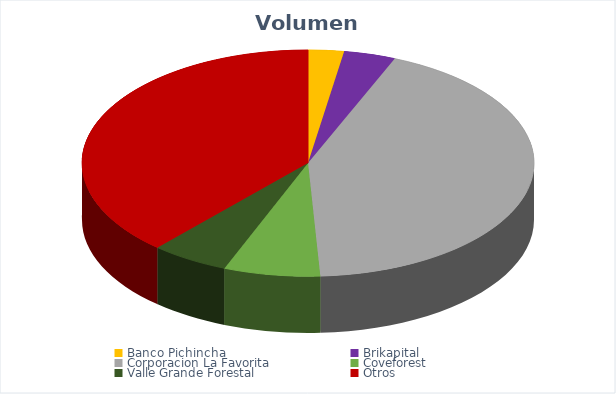
| Category | VOLUMEN ($USD) |
|---|---|
| Banco Pichincha | 6900 |
| Brikapital | 10000 |
| Corporacion La Favorita | 115729.3 |
| Coveforest | 18600.4 |
| Valle Grande Forestal | 15002 |
| Otros | 103711.3 |